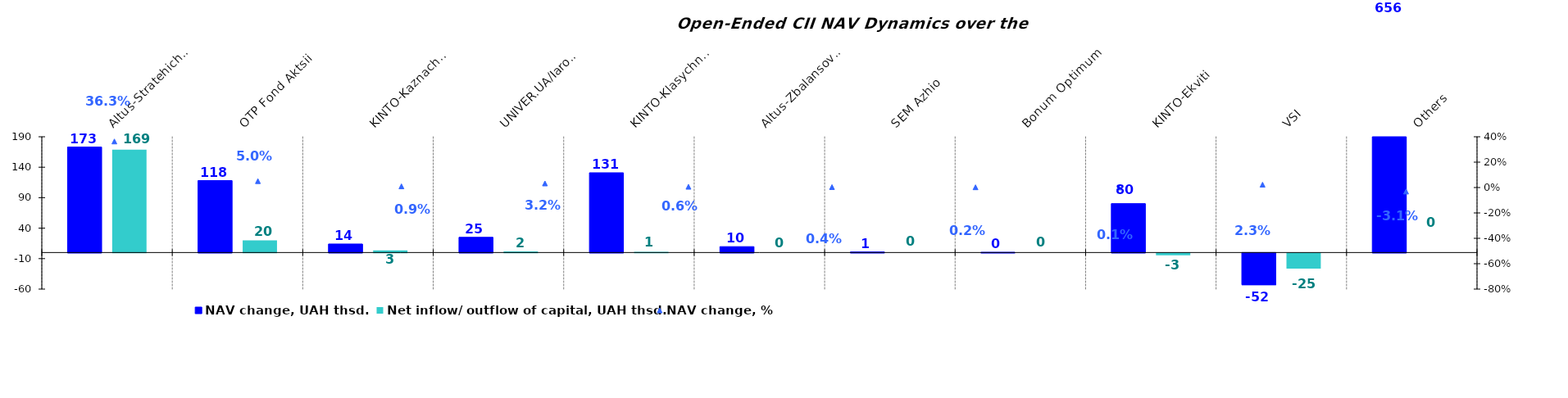
| Category | NAV change, UAH thsd. | Net inflow/ outflow of capital, UAH thsd. |
|---|---|---|
| Altus-Stratehichnyi | 173.116 | 168.927 |
| ОТP Fond Aktsii | 118.061 | 19.954 |
| KINTO-Kaznacheyskyi | 13.982 | 3.4 |
| UNIVER.UA/Iaroslav Mudryi: Fond Aktsii | 24.984 | 1.714 |
| KINTO-Klasychnyi | 130.884 | 1.294 |
| Altus-Zbalansovanyi | 9.656 | 0 |
| SEM Azhio | 0.921 | 0 |
| Bonum Optimum | 0.383 | 0 |
| KINTO-Ekviti | 80.267 | -3.089 |
| VSI | -52.165 | -25.167 |
| Others | 655.624 | 0 |